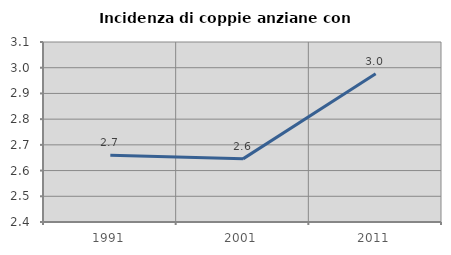
| Category | Incidenza di coppie anziane con figli |
|---|---|
| 1991.0 | 2.66 |
| 2001.0 | 2.646 |
| 2011.0 | 2.976 |